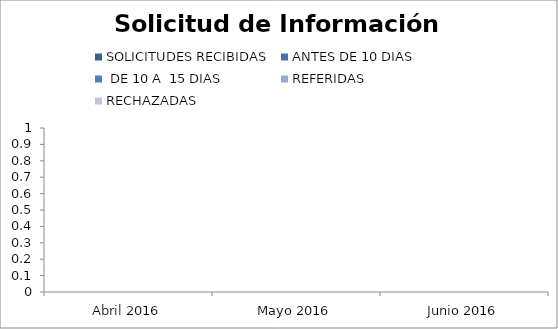
| Category | SOLICITUDES RECIBIDAS | ANTES DE 10 DIAS |  DE 10 A  15 DIAS  | REFERIDAS | RECHAZADAS |
|---|---|---|---|---|---|
| Abril 2016 | 0 | 0 | 0 | 0 | 0 |
| Mayo 2016 | 0 | 0 | 0 | 0 | 0 |
| Junio 2016 | 0 | 0 | 0 | 0 | 0 |